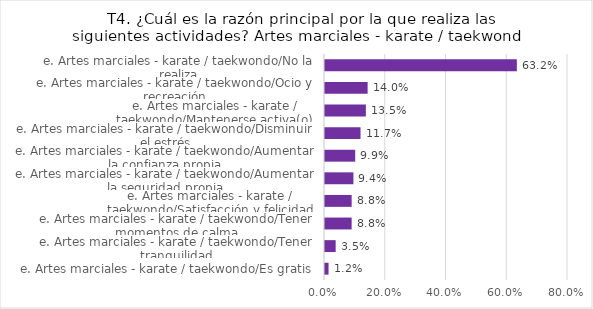
| Category | Series 0 |
|---|---|
| e. Artes marciales - karate / taekwondo/Es gratis | 0.012 |
| e. Artes marciales - karate / taekwondo/Tener tranquilidad | 0.035 |
| e. Artes marciales - karate / taekwondo/Tener momentos de calma | 0.088 |
| e. Artes marciales - karate / taekwondo/Satisfacción y felicidad | 0.088 |
| e. Artes marciales - karate / taekwondo/Aumentar la seguridad propia | 0.094 |
| e. Artes marciales - karate / taekwondo/Aumentar la confianza propia | 0.099 |
| e. Artes marciales - karate / taekwondo/Disminuir el estrés | 0.117 |
| e. Artes marciales - karate / taekwondo/Mantenerse activa(o) | 0.135 |
| e. Artes marciales - karate / taekwondo/Ocio y recreación | 0.14 |
| e. Artes marciales - karate / taekwondo/No la realiza | 0.632 |